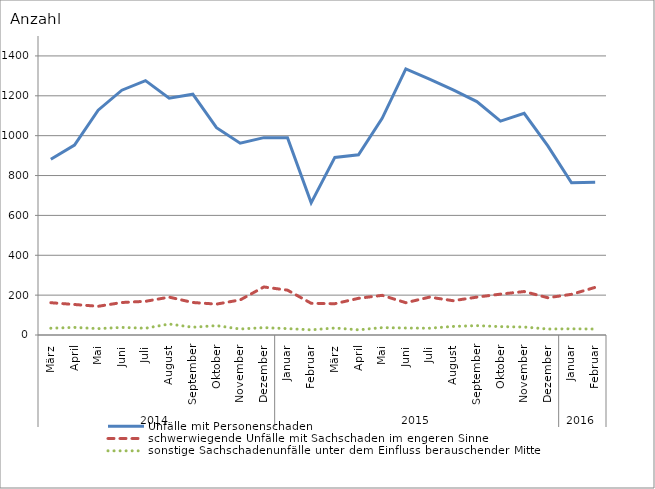
| Category | Unfälle mit Personenschaden | schwerwiegende Unfälle mit Sachschaden im engeren Sinne | sonstige Sachschadenunfälle unter dem Einfluss berauschender Mittel |
|---|---|---|---|
| 0 | 882 | 162 | 34 |
| 1 | 953 | 153 | 38 |
| 2 | 1128 | 144 | 32 |
| 3 | 1228 | 163 | 38 |
| 4 | 1276 | 169 | 34 |
| 5 | 1188 | 190 | 55 |
| 6 | 1208 | 163 | 39 |
| 7 | 1040 | 155 | 47 |
| 8 | 962 | 176 | 30 |
| 9 | 990 | 241 | 37 |
| 10 | 990 | 225 | 32 |
| 11 | 663 | 159 | 26 |
| 12 | 891 | 157 | 35 |
| 13 | 904 | 184 | 26 |
| 14 | 1087 | 199 | 37 |
| 15 | 1335 | 162 | 35 |
| 16 | 1284 | 190 | 34 |
| 17 | 1230 | 172 | 43 |
| 18 | 1171 | 190 | 47 |
| 19 | 1073 | 205 | 42 |
| 20 | 1112 | 218 | 40 |
| 21 | 949 | 187 | 30 |
| 22 | 764 | 204 | 31 |
| 23 | 766 | 239 | 30 |